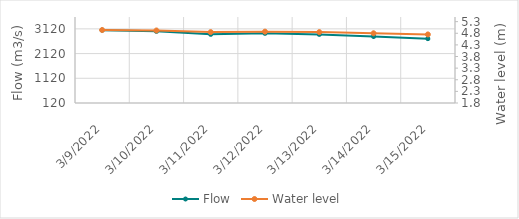
| Category | Flow |
|---|---|
| 2/23/22 | 1581.85 |
| 2/22/22 | 1735.76 |
| 2/21/22 | 1825 |
| 2/20/22 | 1907.4 |
| 2/19/22 | 1919.8 |
| 2/18/22 | 1795.67 |
| 2/17/22 | 1726.25 |